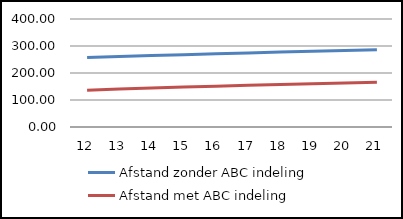
| Category | Afstand zonder ABC indeling | Afstand met ABC indeling |
|---|---|---|
| 12.0 | 257.238 | 136.135 |
| 13.0 | 260.871 | 140.297 |
| 14.0 | 264.367 | 144.184 |
| 15.0 | 267.75 | 147.828 |
| 16.0 | 271.041 | 151.252 |
| 17.0 | 274.256 | 154.48 |
| 18.0 | 277.405 | 157.53 |
| 19.0 | 280.5 | 160.415 |
| 20.0 | 283.548 | 163.151 |
| 21.0 | 286.555 | 165.749 |